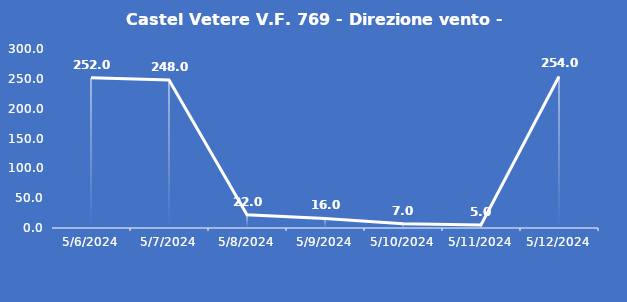
| Category | Castel Vetere V.F. 769 - Direzione vento - Grezzo (°N) |
|---|---|
| 5/6/24 | 252 |
| 5/7/24 | 248 |
| 5/8/24 | 22 |
| 5/9/24 | 16 |
| 5/10/24 | 7 |
| 5/11/24 | 5 |
| 5/12/24 | 254 |